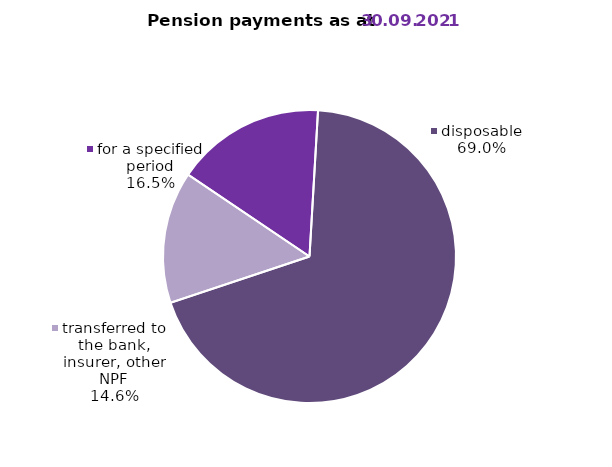
| Category | Series 0 |
|---|---|
| for a specified period | 91.163 |
| disposable | 381.352 |
| transferred to the bank, insurer, other NPF | 80.527 |